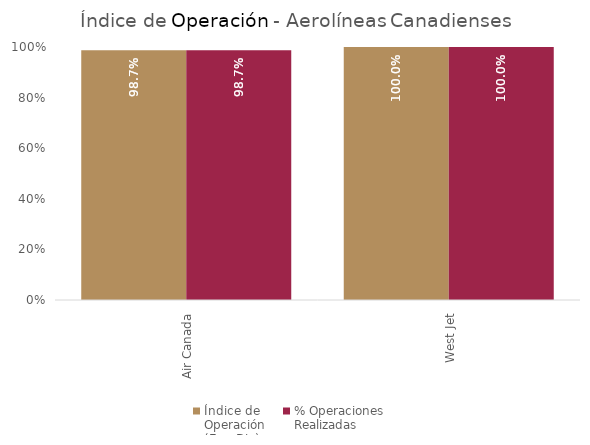
| Category | Índice de 
Operación
(Ene-Dic) | % Operaciones
Realizadas |
|---|---|---|
| Air Canada | 0.987 | 0.987 |
| West Jet | 1 | 1 |